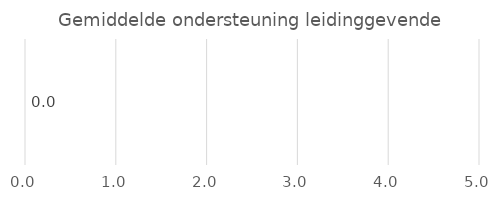
| Category | Series 0 |
|---|---|
| Ondersteuning leidinggevende | 0 |